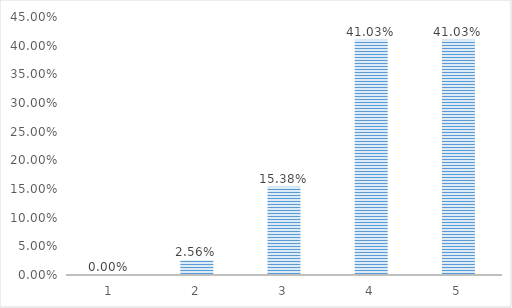
| Category | Series 0 |
|---|---|
| 1.0 | 0 |
| 2.0 | 0.026 |
| 3.0 | 0.154 |
| 4.0 | 0.41 |
| 5.0 | 0.41 |